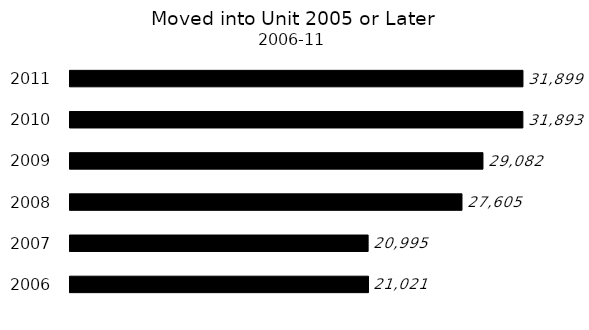
| Category | Series 0 |
|---|---|
| 2006 | 21021 |
| 2007 | 20995 |
| 2008 | 27605 |
| 2009 | 29082 |
| 2010 | 31893 |
| 2011 | 31899 |